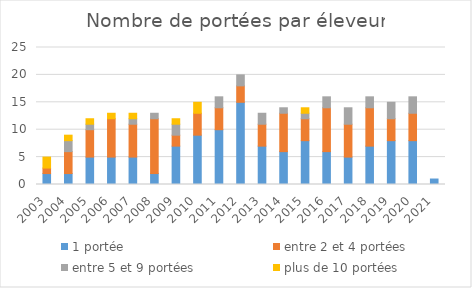
| Category | 1 portée | entre 2 et 4 portées | entre 5 et 9 portées | plus de 10 portées |
|---|---|---|---|---|
| 2003.0 | 2 | 1 | 0 | 2 |
| 2004.0 | 2 | 4 | 2 | 1 |
| 2005.0 | 5 | 5 | 1 | 1 |
| 2006.0 | 5 | 7 | 0 | 1 |
| 2007.0 | 5 | 6 | 1 | 1 |
| 2008.0 | 2 | 10 | 1 | 0 |
| 2009.0 | 7 | 2 | 2 | 1 |
| 2010.0 | 9 | 4 | 0 | 2 |
| 2011.0 | 10 | 4 | 2 | 0 |
| 2012.0 | 15 | 3 | 2 | 0 |
| 2013.0 | 7 | 4 | 2 | 0 |
| 2014.0 | 6 | 7 | 1 | 0 |
| 2015.0 | 8 | 4 | 1 | 1 |
| 2016.0 | 6 | 8 | 2 | 0 |
| 2017.0 | 5 | 6 | 3 | 0 |
| 2018.0 | 7 | 7 | 2 | 0 |
| 2019.0 | 8 | 4 | 3 | 0 |
| 2020.0 | 8 | 5 | 3 | 0 |
| 2021.0 | 1 | 0 | 0 | 0 |